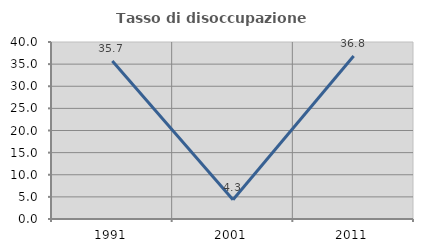
| Category | Tasso di disoccupazione giovanile  |
|---|---|
| 1991.0 | 35.714 |
| 2001.0 | 4.348 |
| 2011.0 | 36.842 |